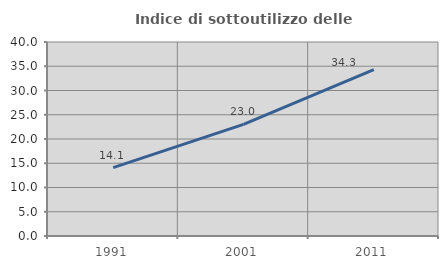
| Category | Indice di sottoutilizzo delle abitazioni  |
|---|---|
| 1991.0 | 14.103 |
| 2001.0 | 23.026 |
| 2011.0 | 34.305 |